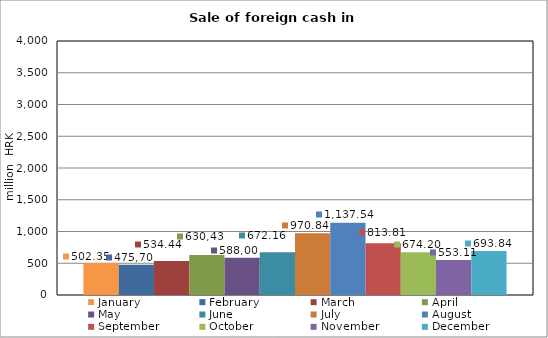
| Category | January | February | March | April | May | June | July | August | September | October | November | December |
|---|---|---|---|---|---|---|---|---|---|---|---|---|
| 0 | 502.354 | 475.695 | 534.436 | 630.432 | 588 | 672.157 | 970.84 | 1137.538 | 813.812 | 674.202 | 553.109 | 693.84 |